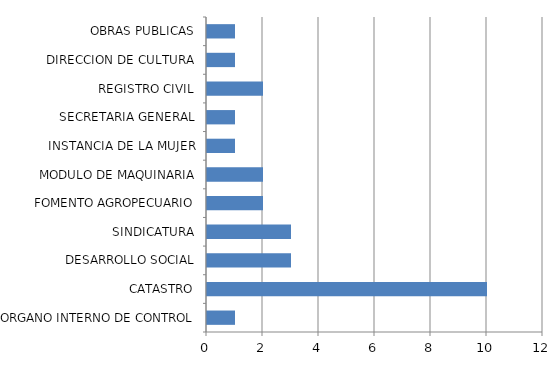
| Category | Series 0 |
|---|---|
| ORGANO INTERNO DE CONTROL | 1 |
| CATASTRO | 10 |
| DESARROLLO SOCIAL | 3 |
| SINDICATURA | 3 |
| FOMENTO AGROPECUARIO | 2 |
| MODULO DE MAQUINARIA | 2 |
| INSTANCIA DE LA MUJER | 1 |
| SECRETARIA GENERAL | 1 |
| REGISTRO CIVIL | 2 |
| DIRECCION DE CULTURA | 1 |
| OBRAS PUBLICAS | 1 |